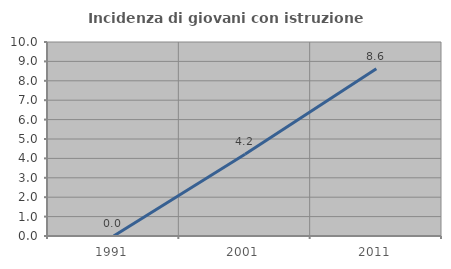
| Category | Incidenza di giovani con istruzione universitaria |
|---|---|
| 1991.0 | 0 |
| 2001.0 | 4.211 |
| 2011.0 | 8.621 |